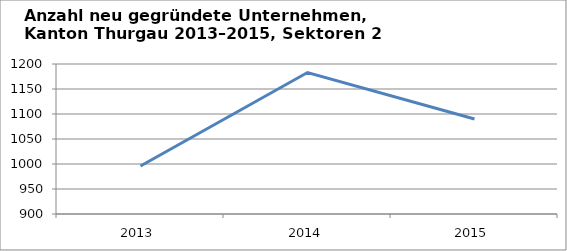
| Category | Sektoren 2 und 3 |
|---|---|
| 2013.0 | 996 |
| 2014.0 | 1183 |
| 2015.0 | 1090 |